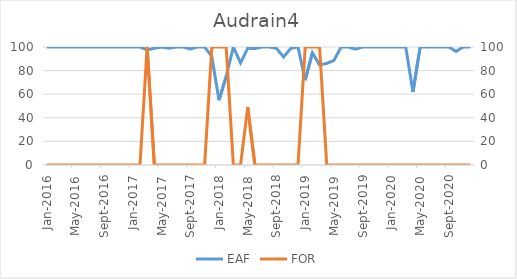
| Category | EAF |
|---|---|
| 2016-01-01 | 100 |
| 2016-02-01 | 100 |
| 2016-03-01 | 100 |
| 2016-04-01 | 100 |
| 2016-05-01 | 100 |
| 2016-06-01 | 100 |
| 2016-07-01 | 100 |
| 2016-08-01 | 100 |
| 2016-09-01 | 100 |
| 2016-10-01 | 100 |
| 2016-11-01 | 100 |
| 2016-12-01 | 100 |
| 2017-01-01 | 100 |
| 2017-02-01 | 100 |
| 2017-03-01 | 97.51 |
| 2017-04-01 | 98.96 |
| 2017-05-01 | 100 |
| 2017-06-01 | 99.03 |
| 2017-07-01 | 100 |
| 2017-08-01 | 100 |
| 2017-09-01 | 98.37 |
| 2017-10-01 | 100 |
| 2017-11-01 | 100 |
| 2017-12-01 | 92 |
| 2018-01-01 | 54.94 |
| 2018-02-01 | 75 |
| 2018-03-01 | 100 |
| 2018-04-01 | 86.59 |
| 2018-05-01 | 98.93 |
| 2018-06-01 | 98.66 |
| 2018-07-01 | 100 |
| 2018-08-01 | 100 |
| 2018-09-01 | 98.89 |
| 2018-10-01 | 91.55 |
| 2018-11-01 | 98.89 |
| 2018-12-01 | 100 |
| 2019-01-01 | 71.91 |
| 2019-02-01 | 95.09 |
| 2019-03-01 | 84.79 |
| 2019-04-01 | 86.11 |
| 2019-05-01 | 88.61 |
| 2019-06-01 | 100 |
| 2019-07-01 | 100 |
| 2019-08-01 | 98.17 |
| 2019-09-01 | 100 |
| 2019-10-01 | 100 |
| 2019-11-01 | 100 |
| 2019-12-01 | 100 |
| 2020-01-01 | 100 |
| 2020-02-01 | 100 |
| 2020-03-01 | 100 |
| 2020-04-01 | 61.88 |
| 2020-05-01 | 100 |
| 2020-06-01 | 100 |
| 2020-07-01 | 100 |
| 2020-08-01 | 100 |
| 2020-09-01 | 100 |
| 2020-10-01 | 96.25 |
| 2020-11-01 | 100 |
| 2020-12-01 | 100 |